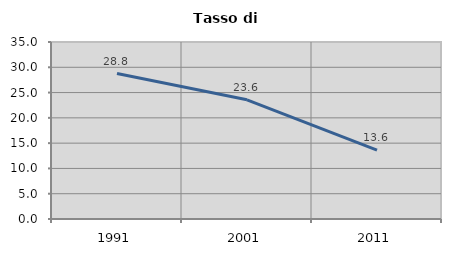
| Category | Tasso di disoccupazione   |
|---|---|
| 1991.0 | 28.769 |
| 2001.0 | 23.575 |
| 2011.0 | 13.619 |